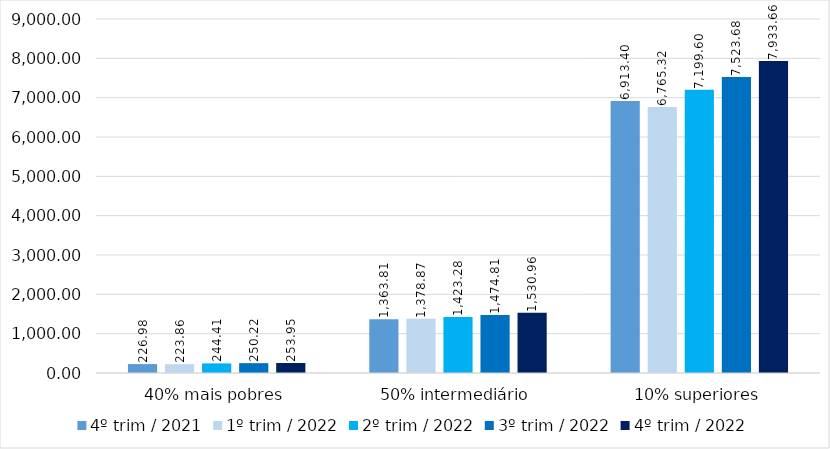
| Category | 4º trim / 2021 | 1º trim / 2022 | 2º trim / 2022 | 3º trim / 2022 | 4º trim / 2022 |
|---|---|---|---|---|---|
| 40% mais pobres | 226.976 | 223.861 | 244.407 | 250.223 | 253.948 |
| 50% intermediário | 1363.807 | 1378.865 | 1423.276 | 1474.808 | 1530.963 |
| 10% superiores | 6913.401 | 6765.323 | 7199.598 | 7523.681 | 7933.658 |